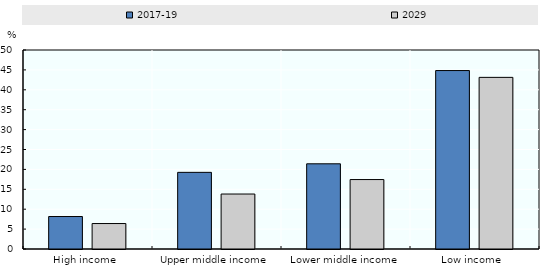
| Category | 2017-19 | 2029 |
|---|---|---|
| High income  | 8.159 | 6.396 |
| Upper middle income | 19.257 | 13.813 |
| Lower middle income | 21.404 | 17.447 |
| Low income  | 44.837 | 43.125 |